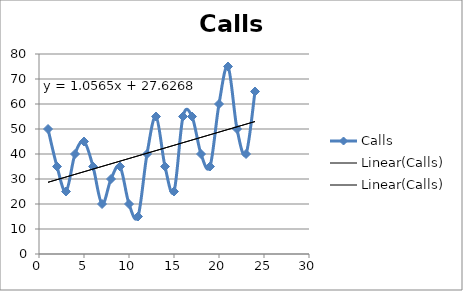
| Category | Calls |
|---|---|
| 1.0 | 50 |
| 2.0 | 35 |
| 3.0 | 25 |
| 4.0 | 40 |
| 5.0 | 45 |
| 6.0 | 35 |
| 7.0 | 20 |
| 8.0 | 30 |
| 9.0 | 35 |
| 10.0 | 20 |
| 11.0 | 15 |
| 12.0 | 40 |
| 13.0 | 55 |
| 14.0 | 35 |
| 15.0 | 25 |
| 16.0 | 55 |
| 17.0 | 55 |
| 18.0 | 40 |
| 19.0 | 35 |
| 20.0 | 60 |
| 21.0 | 75 |
| 22.0 | 50 |
| 23.0 | 40 |
| 24.0 | 65 |